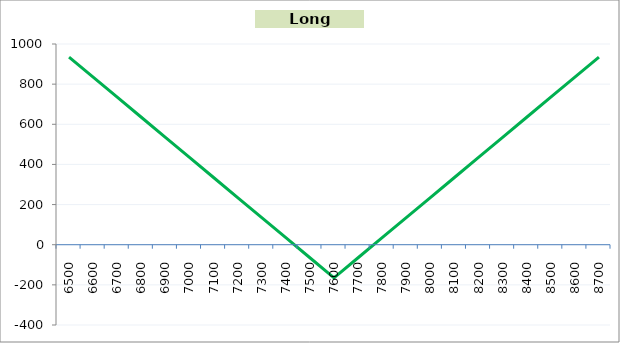
| Category | Series 1 |
|---|---|
| 6500.0 | 935 |
| 6600.0 | 835 |
| 6700.0 | 735 |
| 6800.0 | 635 |
| 6900.0 | 535 |
| 7000.0 | 435 |
| 7100.0 | 335 |
| 7200.0 | 235 |
| 7300.0 | 135 |
| 7400.0 | 35 |
| 7500.0 | -65 |
| 7600.0 | -165 |
| 7700.0 | -65 |
| 7800.0 | 35 |
| 7900.0 | 135 |
| 8000.0 | 235 |
| 8100.0 | 335 |
| 8200.0 | 435 |
| 8300.0 | 535 |
| 8400.0 | 635 |
| 8500.0 | 735 |
| 8600.0 | 835 |
| 8700.0 | 935 |